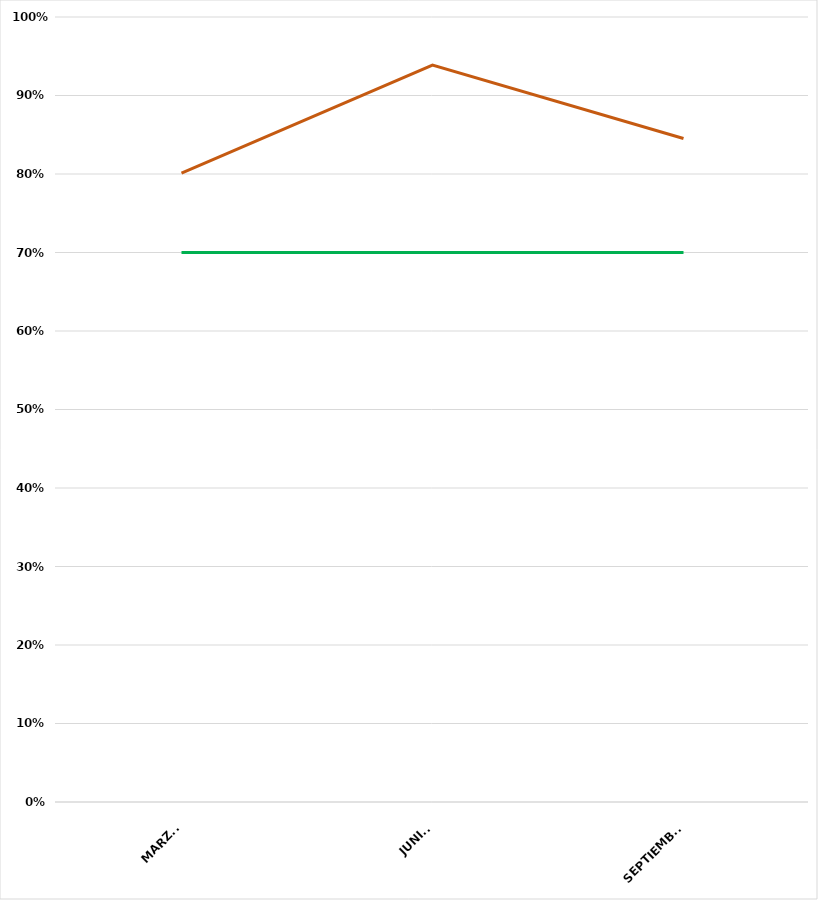
| Category | VALOR  | META PONDERADA |
|---|---|---|
| MARZO | 0.801 | 0.7 |
| JUNIO | 0.939 | 0.7 |
| SEPTIEMBRE | 0.845 | 0.7 |